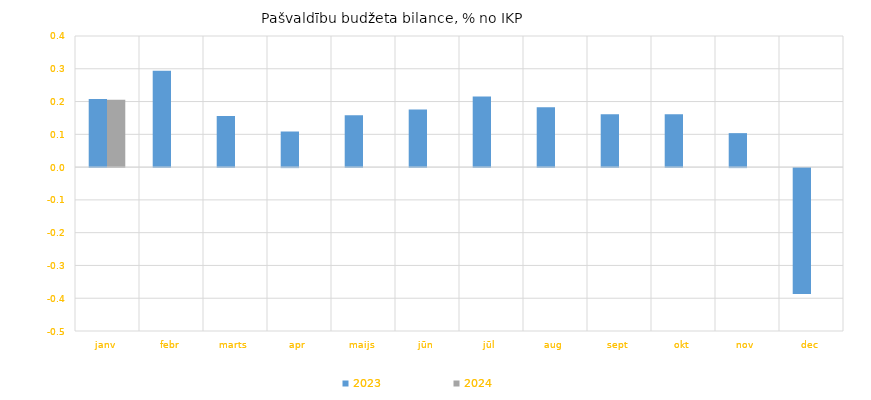
| Category | 2023 | 2024 |
|---|---|---|
| janv | 0.208 | 0.205 |
| febr | 0.294 | 0 |
| marts | 0.156 | 0 |
| apr | 0.109 | 0 |
| maijs | 0.158 | 0 |
| jūn | 0.176 | 0 |
| jūl | 0.215 | 0 |
| aug | 0.183 | 0 |
| sept | 0.161 | 0 |
| okt | 0.161 | 0 |
| nov | 0.104 | 0 |
| dec | -0.384 | 0 |